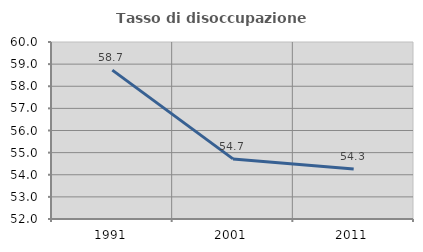
| Category | Tasso di disoccupazione giovanile  |
|---|---|
| 1991.0 | 58.73 |
| 2001.0 | 54.717 |
| 2011.0 | 54.264 |